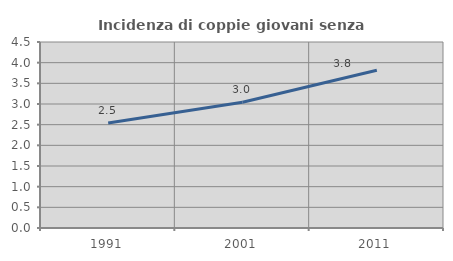
| Category | Incidenza di coppie giovani senza figli |
|---|---|
| 1991.0 | 2.542 |
| 2001.0 | 3.043 |
| 2011.0 | 3.817 |